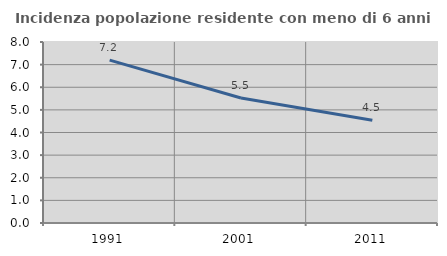
| Category | Incidenza popolazione residente con meno di 6 anni |
|---|---|
| 1991.0 | 7.201 |
| 2001.0 | 5.526 |
| 2011.0 | 4.543 |